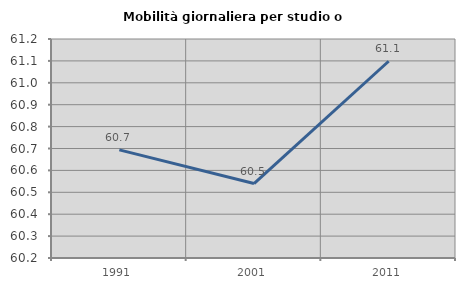
| Category | Mobilità giornaliera per studio o lavoro |
|---|---|
| 1991.0 | 60.694 |
| 2001.0 | 60.54 |
| 2011.0 | 61.098 |